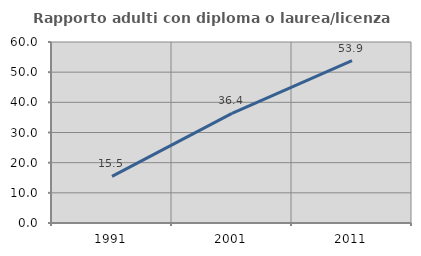
| Category | Rapporto adulti con diploma o laurea/licenza media  |
|---|---|
| 1991.0 | 15.459 |
| 2001.0 | 36.364 |
| 2011.0 | 53.857 |